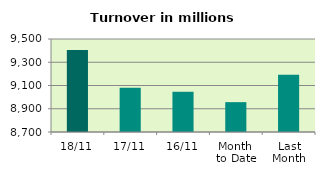
| Category | Series 0 |
|---|---|
| 18/11 | 9405.985 |
| 17/11 | 9079.892 |
| 16/11 | 9046.07 |
| Month 
to Date | 8956.726 |
| Last
Month | 9192.028 |